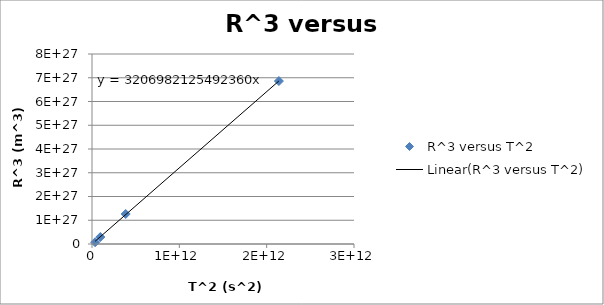
| Category | R^3 versus T^2 |
|---|---|
| 35887756083.6096 | 75071338681625002576445440 |
| 95204139230.8224 | 294013296237374988032671744 |
| 385909318656.0 | 1263494916395712019278331904 |
| 2140143914589.9177 | 6859908677124087910361989120 |